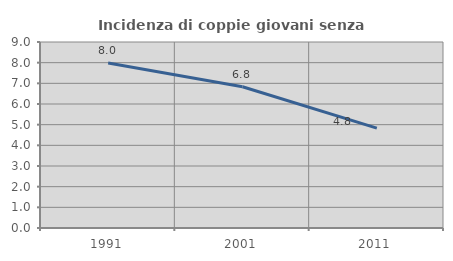
| Category | Incidenza di coppie giovani senza figli |
|---|---|
| 1991.0 | 7.984 |
| 2001.0 | 6.835 |
| 2011.0 | 4.833 |